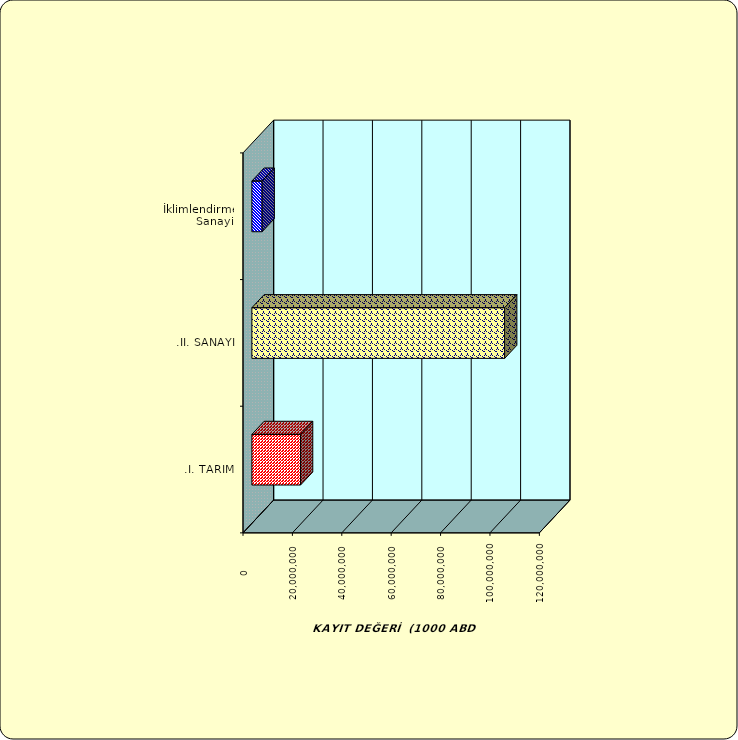
| Category | Series 0 |
|---|---|
| .I. TARIM | 19703366.983 |
| .II. SANAYİ | 102345819.877 |
|  İklimlendirme Sanayii | 4153316.237 |